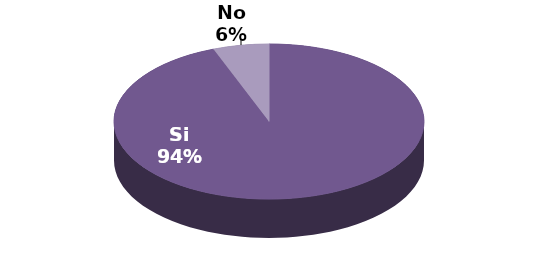
| Category | Series 1 |
|---|---|
| Si | 194 |
| No | 12 |